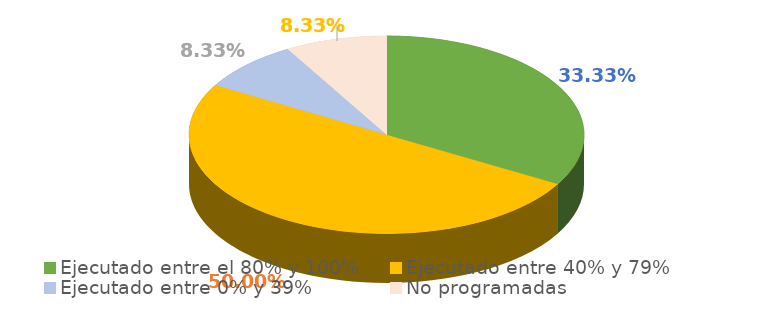
| Category | Series 0 |
|---|---|
| Ejecutado entre el 80% y 100% | 0.333 |
| Ejecutado entre 40% y 79% | 0.5 |
| Ejecutado entre 0% y 39% | 0.083 |
| No programadas | 0.083 |